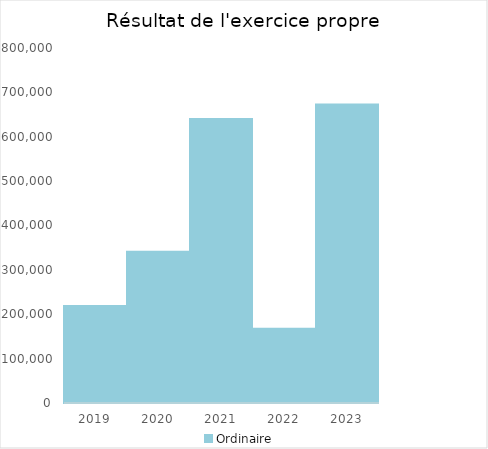
| Category |   | Ordinaire |    |
|---|---|---|---|
| 2019.0 |  | 218449.11 |  |
| 2020.0 |  | 341089.67 |  |
| 2021.0 |  | 639874.82 |  |
| 2022.0 |  | 167230.22 |  |
| 2023.0 |  | 672800.06 |  |